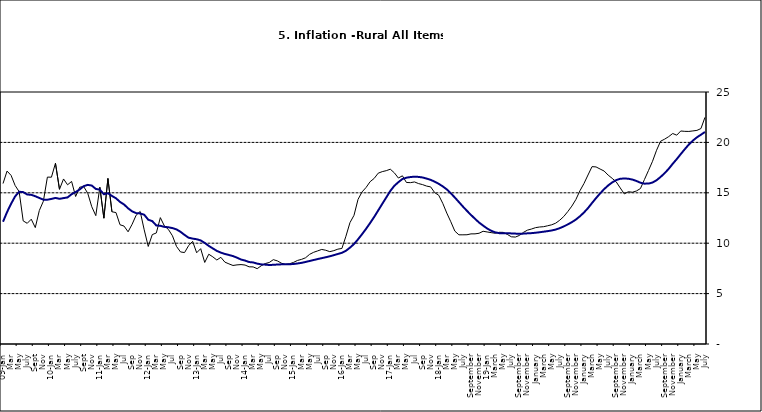
| Category | Series 0 | Series 1 |
|---|---|---|
| 09-Jan | 15.918 | 12.128 |
| Feb | 17.154 | 13.086 |
| Mar | 16.729 | 13.912 |
| Apr | 15.727 | 14.644 |
| May | 15.113 | 15.104 |
| June | 12.213 | 15.067 |
| July | 11.974 | 14.832 |
| Aug | 12.38 | 14.796 |
| Sept | 11.548 | 14.661 |
| Oct | 13.242 | 14.488 |
| Nov | 14.164 | 14.321 |
|  | 16.557 | 14.316 |
| 10-Jan | 16.548 | 14.39 |
| Feb | 17.934 | 14.494 |
| Mar | 15.346 | 14.401 |
| Apr | 16.373 | 14.473 |
| May | 15.794 | 14.54 |
| June | 16.126 | 14.862 |
| July | 14.634 | 15.072 |
| Aug | 15.556 | 15.33 |
| Sept | 15.616 | 15.658 |
| Oct | 14.955 | 15.786 |
| Nov | 13.616 | 15.719 |
| Dec | 12.735 | 15.385 |
| 11-Jan | 15.553 | 15.311 |
| Feb | 12.482 | 14.856 |
| Mar | 16.422 | 14.956 |
| Apr | 13.117 | 14.687 |
| May | 13.041 | 14.457 |
| Jun | 11.83 | 14.095 |
| Jul | 11.699 | 13.84 |
| Aug | 11.13 | 13.464 |
| Sep | 11.878 | 13.156 |
| Oct | 12.778 | 12.985 |
| Nov | 13.147 | 12.95 |
| Dec | 11.326 | 12.824 |
| 12-Jan | 9.678 | 12.33 |
| Feb | 10.856 | 12.188 |
| Mar | 11.014 | 11.76 |
| Apr | 12.536 | 11.724 |
| May | 11.712 | 11.621 |
| Jun | 11.36 | 11.582 |
| Jul | 10.733 | 11.499 |
| Aug | 9.683 | 11.368 |
| Sep | 9.132 | 11.131 |
| Oct | 9.071 | 10.82 |
| Nov | 9.758 | 10.548 |
| Dec | 10.183 | 10.455 |
| 13-Jan | 9.052 | 10.394 |
| Feb | 9.457 | 10.276 |
| Mar | 8.091 | 10.025 |
| Apr | 8.907 | 9.732 |
| May | 8.647 | 9.483 |
| Jun | 8.333 | 9.236 |
| Jul | 8.6 | 9.063 |
| Aug | 8.12 | 8.933 |
| Sep | 7.95 | 8.832 |
| Oct | 7.791 | 8.722 |
| Nov | 7.849 | 8.565 |
| Dec | 7.879 | 8.378 |
| 14-Jan | 7.832 | 8.277 |
| Feb | 7.657 | 8.13 |
| Mar | 7.65 | 8.092 |
| Apr | 7.473 | 7.973 |
| May | 7.761 | 7.901 |
| Jun | 7.98 | 7.874 |
| Jul | 8.086 | 7.834 |
| Aug | 8.368 | 7.858 |
| Sep | 8.244 | 7.883 |
| Oct | 8.019 | 7.903 |
| Nov | 7.898 | 7.906 |
| Dec | 7.955 | 7.913 |
| 15-Jan | 8.094 | 7.935 |
| Feb | 8.291 | 7.988 |
| Mar | 8.396 | 8.05 |
| Apr | 8.556 | 8.14 |
| May | 8.896 | 8.236 |
| Jun | 9.098 | 8.331 |
| Jul | 9.238 | 8.429 |
| Aug | 9.382 | 8.516 |
| Sep | 9.3 | 8.606 |
| Oct | 9.162 | 8.7 |
| Nov | 9.261 | 8.813 |
| Dec | 9.41 | 8.933 |
| 16-Jan | 9.48 | 9.047 |
| Feb | 10.692 | 9.249 |
| Mar | 12.038 | 9.559 |
| Apr | 12.767 | 9.917 |
| May | 14.349 | 10.384 |
| Jun | 15.088 | 10.897 |
| Jul | 15.533 | 11.433 |
| Aug | 16.103 | 12.002 |
| Sep | 16.428 | 12.601 |
| Oct | 16.947 | 13.25 |
| Nov | 17.099 | 13.898 |
| Dec | 17.195 | 14.54 |
| 17-Jan | 17.341 | 15.183 |
| Feb | 16.982 | 15.696 |
| Mar | 16.466 | 16.054 |
| Apr | 16.687 | 16.369 |
| May | 16.023 | 16.497 |
| Jun | 16.007 | 16.563 |
| Jul | 16.078 | 16.6 |
| Aug | 15.914 | 16.577 |
| Sep | 15.812 | 16.52 |
| Oct | 15.666 | 16.411 |
| Nov | 15.587 | 16.285 |
| Dec | 15.018 | 16.104 |
| 18-Jan | 14.756 | 15.892 |
| Feb | 13.957 | 15.638 |
| Mar | 12.987 | 15.339 |
| Apr | 12.126 | 14.95 |
| May | 11.199 | 14.53 |
| June | 10.832 | 14.083 |
| July | 10.831 | 13.636 |
| August | 10.838 | 13.209 |
| September | 10.924 | 12.804 |
| October | 10.927 | 12.418 |
| November | 10.986 | 12.049 |
| December | 11.183 | 11.746 |
| 19-Jan | 11.115 | 11.462 |
| February | 11.048 | 11.234 |
| March | 10.99 | 11.078 |
| April | 11.08 | 10.997 |
| May | 11.075 | 10.988 |
| June | 10.874 | 10.99 |
| July | 10.636 | 10.972 |
| August | 10.609 | 10.951 |
| September | 10.771 | 10.937 |
| October | 11.074 | 10.95 |
| November | 11.296 | 10.977 |
| December | 11.406 | 10.998 |
| January | 11.543 | 11.037 |
| February | 11.606 | 11.086 |
| March | 11.639 | 11.141 |
| April | 11.728 | 11.197 |
| May | 11.826 | 11.261 |
| June | 11.988 | 11.355 |
| July | 12.28 | 11.493 |
| August | 12.651 | 11.664 |
| September | 13.14 | 11.864 |
| October | 13.68 | 12.086 |
| November | 14.335 | 12.346 |
| December | 15.2 | 12.67 |
| January | 15.918 | 13.043 |
| February | 16.766 | 13.482 |
| March | 17.596 | 13.985 |
| April | 17.566 | 14.475 |
| May | 17.358 | 14.935 |
| June | 17.159 | 15.362 |
| July | 16.753 | 15.726 |
| August | 16.433 | 16.03 |
| September | 16.081 | 16.26 |
| October | 15.48 | 16.393 |
| November | 14.89 | 16.419 |
| December | 15.106 | 16.397 |
| January | 15.055 | 16.313 |
| February | 15.179 | 16.176 |
| March | 15.421 | 15.999 |
| April | 16.321 | 15.908 |
| May | 17.215 | 15.915 |
| June | 18.128 | 16.017 |
| July | 19.224 | 16.246 |
| August | 20.118 | 16.575 |
| September | 20.322 | 16.944 |
| October | 20.572 | 17.376 |
| November | 20.882 | 17.876 |
| December | 20.718 | 18.342 |
| January | 21.134 | 18.844 |
| February | 21.096 | 19.329 |
| March | 21.088 | 19.79 |
| April | 21.138 | 20.18 |
| May | 21.19 | 20.501 |
| June | 21.373 | 20.762 |
| July | 22.485 | 21.037 |